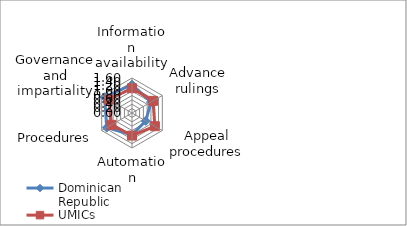
| Category | Dominican Republic | UMICs |
|---|---|---|
| Information availability | 1.3 | 1.134 |
| Advance rulings | 1 | 1.109 |
| Appeal procedures | 0.727 | 1.208 |
| Automation | 1 | 1.033 |
| Procedures | 1.333 | 1.084 |
| Governance and impartiality | 1.444 | 1.223 |